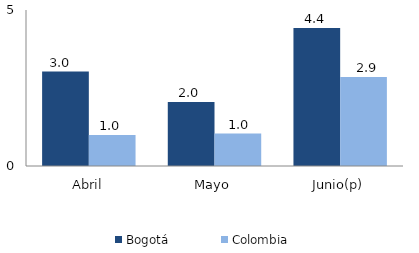
| Category | Bogotá | Colombia |
|---|---|---|
| Abril | 3.028 | 0.996 |
| Mayo | 2.05 | 1.038 |
| Junio(p) | 4.424 | 2.856 |